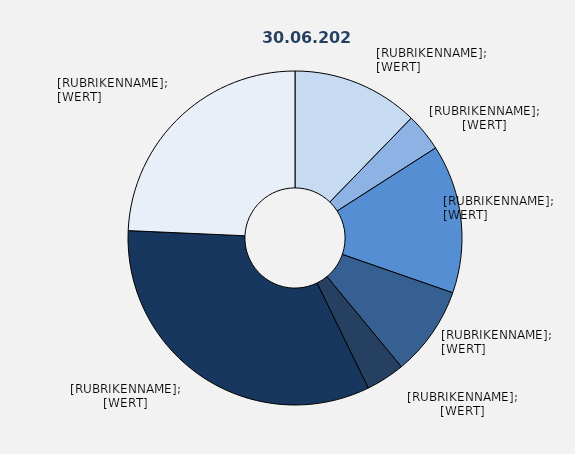
| Category | Series 1 |
|---|---|
| Produzierendes Gewerbe² ohne Baugewerbe | 12.259 |
| Baugewerbe | 3.679 |
| Handel | 14.387 |
| Verkehr und Lagerei | 8.688 |
| Gastgewerbe | 3.755 |
| Erbringung von Unternehmensdienstleistungen | 32.938 |
| Erbringung von öffentlichen und privaten Dienstleistungen | 24.294 |